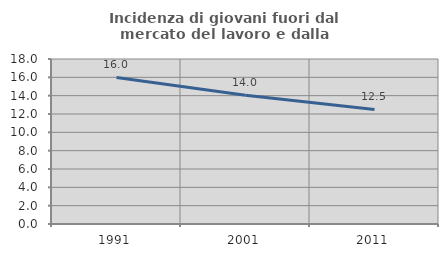
| Category | Incidenza di giovani fuori dal mercato del lavoro e dalla formazione  |
|---|---|
| 1991.0 | 15.994 |
| 2001.0 | 14.047 |
| 2011.0 | 12.5 |